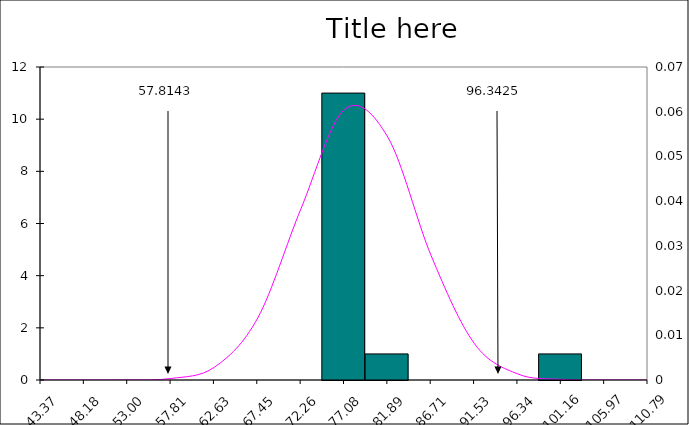
| Category | Series 0 |
|---|---|
| 43.366219131248066 | 0 |
| 48.182242771839 | 0 |
| 52.998266412429935 | 0 |
| 57.81429005302087 | 0 |
| 62.630313693611804 | 0 |
| 67.44633733420274 | 0 |
| 72.26236097479367 | 0 |
| 77.0783846153846 | 11 |
| 81.89440825597555 | 1 |
| 86.71043189656649 | 0 |
| 91.52645553715743 | 0 |
| 96.34247917774837 | 0 |
| 101.15850281833931 | 1 |
| 105.97452645893026 | 0 |
| 110.7905500995212 | 0 |